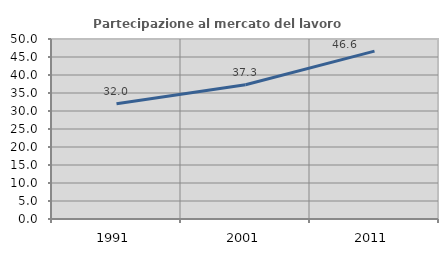
| Category | Partecipazione al mercato del lavoro  femminile |
|---|---|
| 1991.0 | 31.995 |
| 2001.0 | 37.304 |
| 2011.0 | 46.645 |